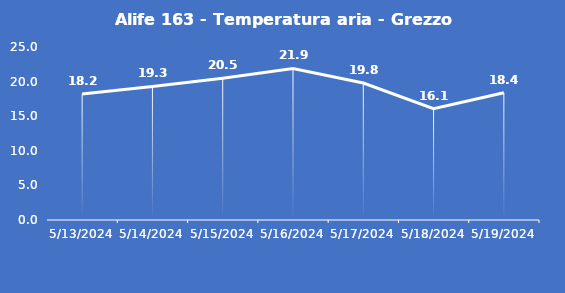
| Category | Alife 163 - Temperatura aria - Grezzo (°C) |
|---|---|
| 5/13/24 | 18.2 |
| 5/14/24 | 19.3 |
| 5/15/24 | 20.5 |
| 5/16/24 | 21.9 |
| 5/17/24 | 19.8 |
| 5/18/24 | 16.1 |
| 5/19/24 | 18.4 |